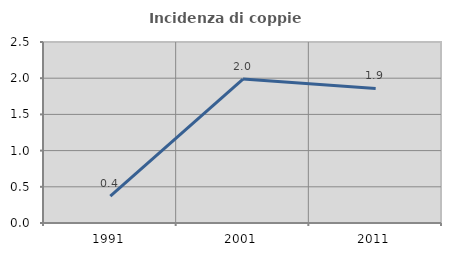
| Category | Incidenza di coppie miste |
|---|---|
| 1991.0 | 0.37 |
| 2001.0 | 1.988 |
| 2011.0 | 1.859 |